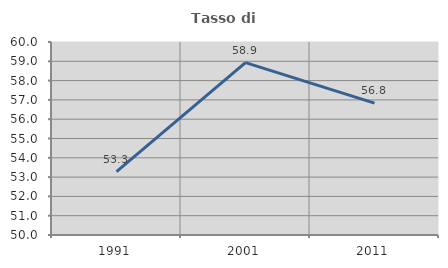
| Category | Tasso di occupazione   |
|---|---|
| 1991.0 | 53.283 |
| 2001.0 | 58.931 |
| 2011.0 | 56.832 |